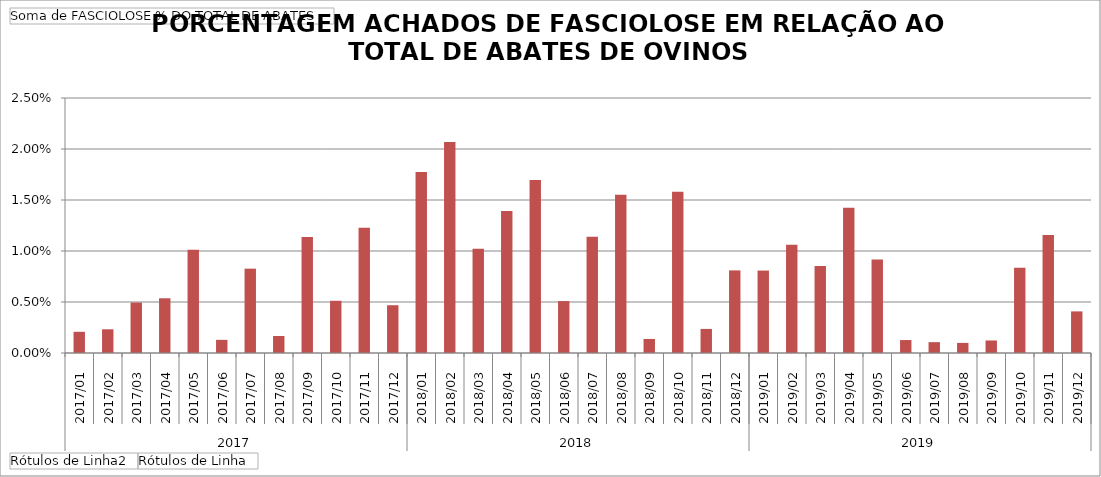
| Category | Total |
|---|---|
| 0 | 0.002 |
| 1 | 0.002 |
| 2 | 0.005 |
| 3 | 0.005 |
| 4 | 0.01 |
| 5 | 0.001 |
| 6 | 0.008 |
| 7 | 0.002 |
| 8 | 0.011 |
| 9 | 0.005 |
| 10 | 0.012 |
| 11 | 0.005 |
| 12 | 0.018 |
| 13 | 0.021 |
| 14 | 0.01 |
| 15 | 0.014 |
| 16 | 0.017 |
| 17 | 0.005 |
| 18 | 0.011 |
| 19 | 0.016 |
| 20 | 0.001 |
| 21 | 0.016 |
| 22 | 0.002 |
| 23 | 0.008 |
| 24 | 0.008 |
| 25 | 0.011 |
| 26 | 0.009 |
| 27 | 0.014 |
| 28 | 0.009 |
| 29 | 0.001 |
| 30 | 0.001 |
| 31 | 0.001 |
| 32 | 0.001 |
| 33 | 0.008 |
| 34 | 0.012 |
| 35 | 0.004 |